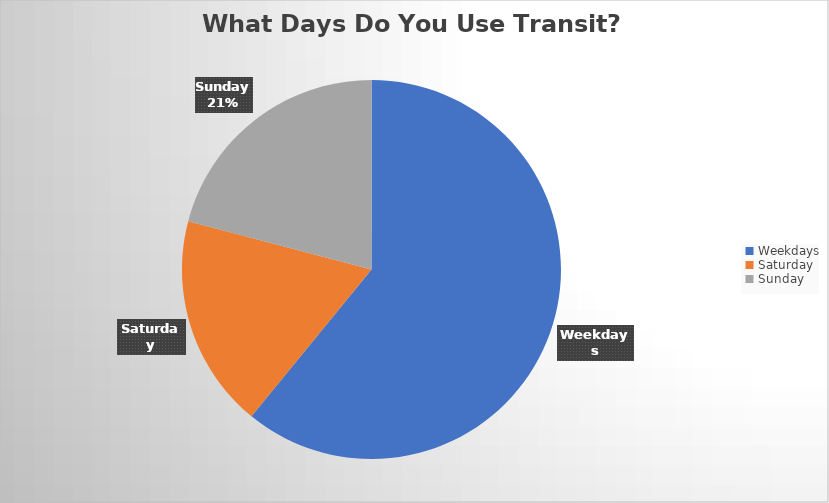
| Category | Series 0 |
|---|---|
| Weekdays | 67 |
| Saturday | 20 |
| Sunday | 23 |